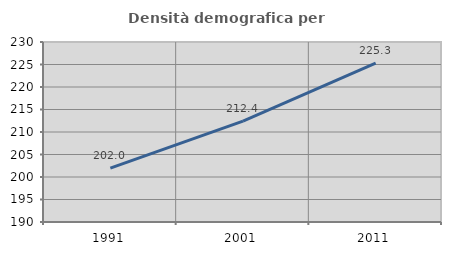
| Category | Densità demografica |
|---|---|
| 1991.0 | 201.967 |
| 2001.0 | 212.43 |
| 2011.0 | 225.302 |